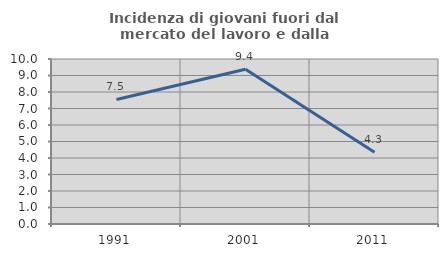
| Category | Incidenza di giovani fuori dal mercato del lavoro e dalla formazione  |
|---|---|
| 1991.0 | 7.547 |
| 2001.0 | 9.375 |
| 2011.0 | 4.348 |